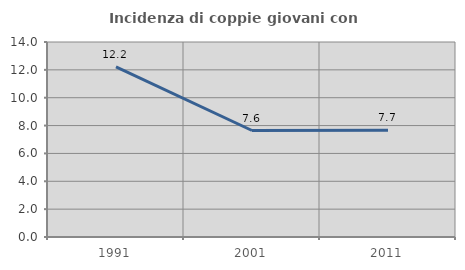
| Category | Incidenza di coppie giovani con figli |
|---|---|
| 1991.0 | 12.209 |
| 2001.0 | 7.645 |
| 2011.0 | 7.667 |